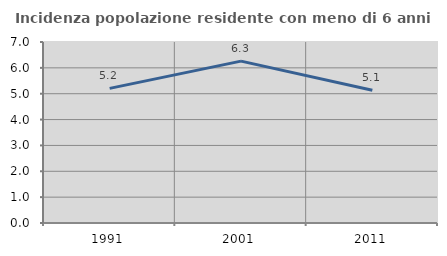
| Category | Incidenza popolazione residente con meno di 6 anni |
|---|---|
| 1991.0 | 5.207 |
| 2001.0 | 6.26 |
| 2011.0 | 5.133 |